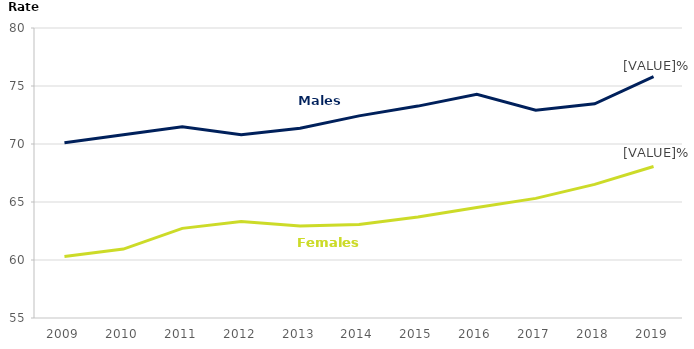
| Category | Male | Female |
|---|---|---|
| 2009.0 | 70.1 | 60.3 |
| 2010.0 | 70.798 | 60.939 |
| 2011.0 | 71.475 | 62.727 |
| 2012.0 | 70.8 | 63.315 |
| 2013.0 | 71.357 | 62.938 |
| 2014.0 | 72.427 | 63.055 |
| 2015.0 | 73.267 | 63.705 |
| 2016.0 | 74.288 | 64.519 |
| 2017.0 | 72.911 | 65.313 |
| 2018.0 | 73.467 | 66.522 |
| 2019.0 | 75.808 | 68.056 |